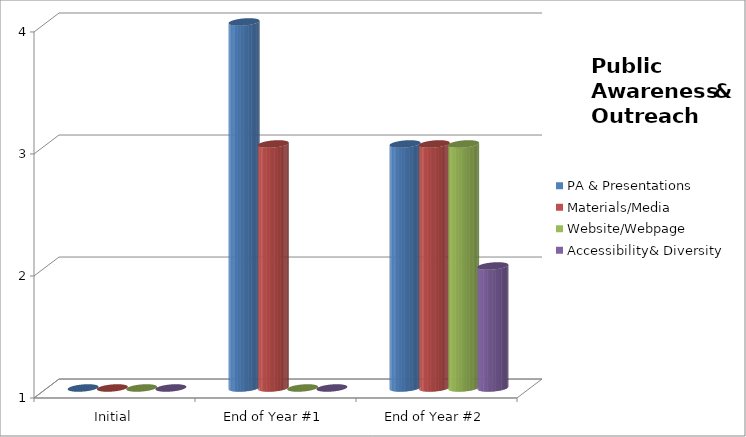
| Category | PA & Presentations  | Materials/Media  | Website/Webpage  | Accessibility& Diversity  |
|---|---|---|---|---|
| Initial | 1 | 1 | 1 | 1 |
| End of Year #1 | 4 | 3 | 1 | 1 |
| End of Year #2 | 3 | 3 | 3 | 2 |